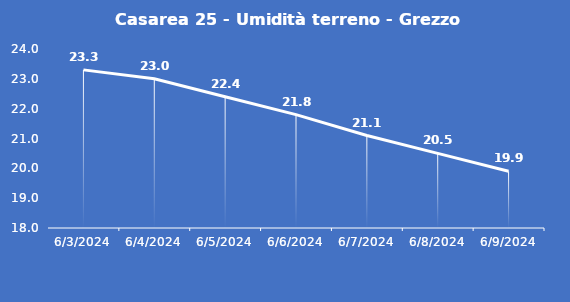
| Category | Casarea 25 - Umidità terreno - Grezzo (%VWC) |
|---|---|
| 6/3/24 | 23.3 |
| 6/4/24 | 23 |
| 6/5/24 | 22.4 |
| 6/6/24 | 21.8 |
| 6/7/24 | 21.1 |
| 6/8/24 | 20.5 |
| 6/9/24 | 19.9 |